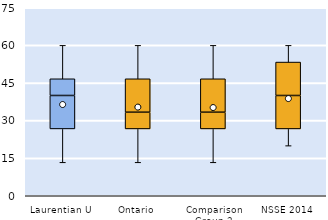
| Category | 25th | 50th | 75th |
|---|---|---|---|
| Laurentian U | 26.667 | 13.333 | 6.667 |
| Ontario | 26.667 | 6.667 | 13.333 |
| Comparison Group 2 | 26.667 | 6.667 | 13.333 |
| NSSE 2014 | 26.667 | 13.333 | 13.333 |